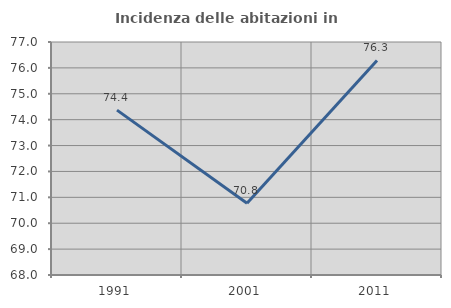
| Category | Incidenza delle abitazioni in proprietà  |
|---|---|
| 1991.0 | 74.37 |
| 2001.0 | 70.771 |
| 2011.0 | 76.286 |